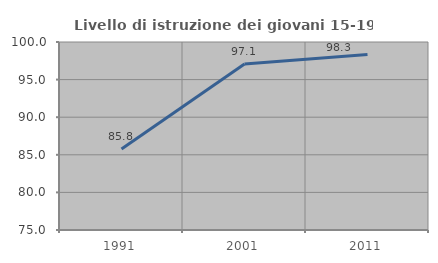
| Category | Livello di istruzione dei giovani 15-19 anni |
|---|---|
| 1991.0 | 85.768 |
| 2001.0 | 97.08 |
| 2011.0 | 98.341 |